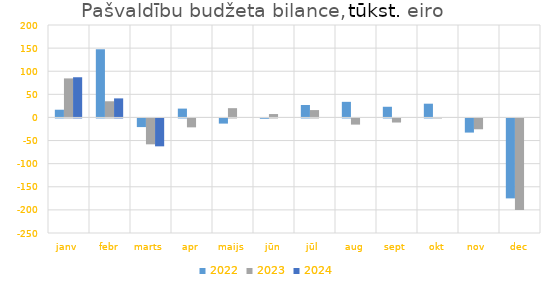
| Category | 2022 | 2023 | 2024 |
|---|---|---|---|
| janv | 16703.923 | 84479.098 | 86956.73 |
| febr | 147501.748 | 34983.794 | 41221.027 |
| marts | -18692.108 | -56013.768 | -60330.828 |
| apr | 19123.02 | -19285.064 | 0 |
| maijs | -11153.489 | 20083.006 | 0 |
| jūn | -682.628 | 7354.828 | 0 |
| jūl | 26988.29 | 15950.076 | 0 |
| aug | 33769.918 | -13326.082 | 0 |
| sept | 23100.994 | -8815.561 | 0 |
| okt | 29746.087 | 166.102 | 0 |
| nov | -30579.652 | -23436.839 | 0 |
| dec | -172941.944 | -198139.706 | 0 |